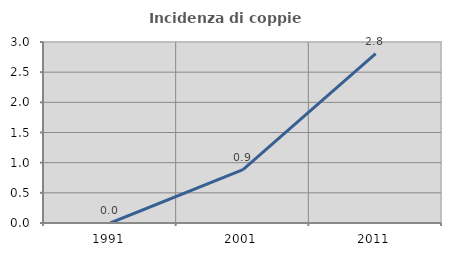
| Category | Incidenza di coppie miste |
|---|---|
| 1991.0 | 0 |
| 2001.0 | 0.885 |
| 2011.0 | 2.807 |